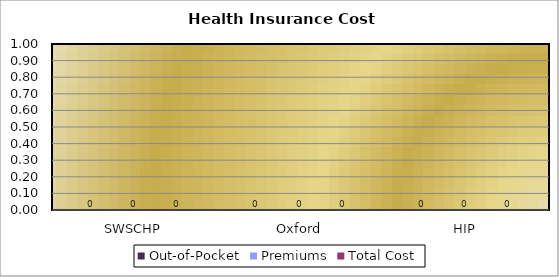
| Category | Out-of-Pocket | Premiums | Total Cost |
|---|---|---|---|
| 0 | 0 | 0 | 0 |
| 1 | 0 | 0 | 0 |
| 2 | 0 | 0 | 0 |